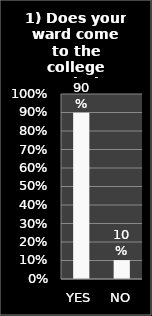
| Category | Series 0 |
|---|---|
| YES | 0.898 |
| NO | 0.102 |